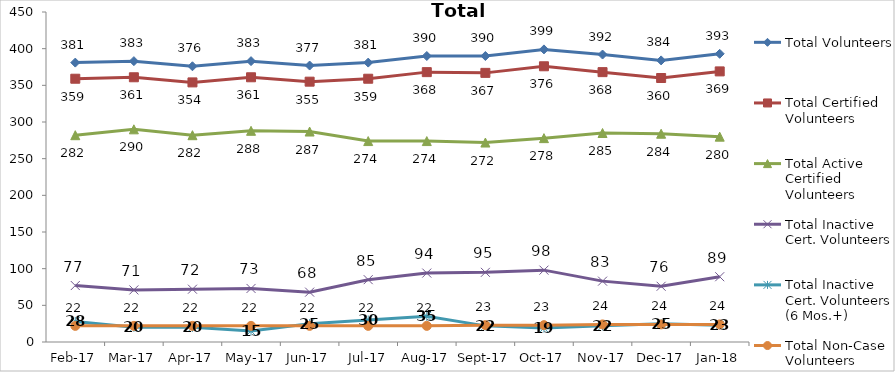
| Category | Total Volunteers | Total Certified Volunteers | Total Active Certified Volunteers | Total Inactive Cert. Volunteers | Total Inactive Cert. Volunteers (6 Mos.+) | Total Non-Case Volunteers |
|---|---|---|---|---|---|---|
| 2017-02-01 | 381 | 359 | 282 | 77 | 28 | 22 |
| 2017-03-01 | 383 | 361 | 290 | 71 | 20 | 22 |
| 2017-04-01 | 376 | 354 | 282 | 72 | 20 | 22 |
| 2017-05-01 | 383 | 361 | 288 | 73 | 15 | 22 |
| 2017-06-01 | 377 | 355 | 287 | 68 | 25 | 22 |
| 2017-07-01 | 381 | 359 | 274 | 85 | 30 | 22 |
| 2017-08-01 | 390 | 368 | 274 | 94 | 35 | 22 |
| 2017-09-01 | 390 | 367 | 272 | 95 | 22 | 23 |
| 2017-10-01 | 399 | 376 | 278 | 98 | 19 | 23 |
| 2017-11-01 | 392 | 368 | 285 | 83 | 22 | 24 |
| 2017-12-01 | 384 | 360 | 284 | 76 | 25 | 24 |
| 2018-01-01 | 393 | 369 | 280 | 89 | 23 | 24 |